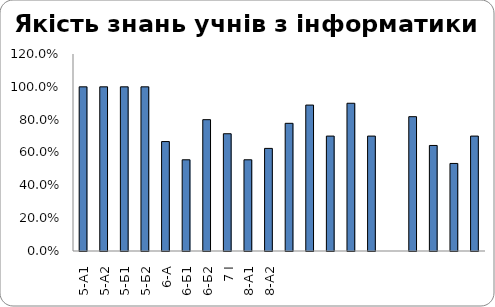
| Category | Series 0 |
|---|---|
| 5-А1 | 1 |
| 5-А2 | 1 |
| 5-Б1 | 1 |
| 5-Б2 | 1 |
| 6-А | 0.667 |
| 6-Б1 | 0.556 |
| 6-Б2 | 0.8 |
| 7 І | 0.714 |
| 8-А1 | 0.556 |
| 8-А2 | 0.625 |